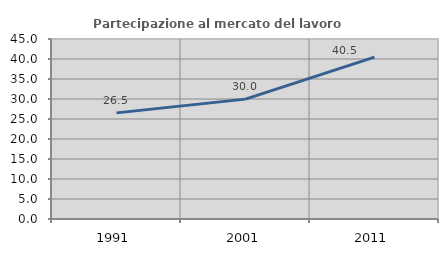
| Category | Partecipazione al mercato del lavoro  femminile |
|---|---|
| 1991.0 | 26.531 |
| 2001.0 | 29.968 |
| 2011.0 | 40.483 |